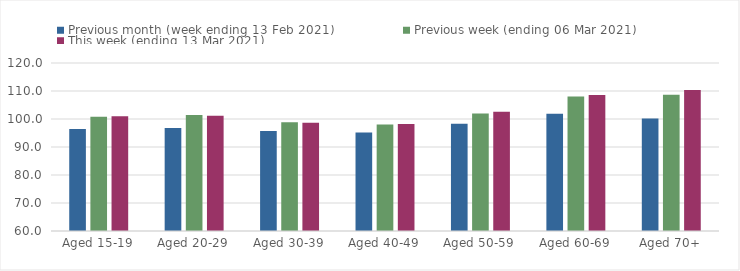
| Category | Previous month (week ending 13 Feb 2021) | Previous week (ending 06 Mar 2021) | This week (ending 13 Mar 2021) |
|---|---|---|---|
| Aged 15-19 | 96.42 | 100.82 | 100.96 |
| Aged 20-29 | 96.83 | 101.44 | 101.14 |
| Aged 30-39 | 95.67 | 98.81 | 98.64 |
| Aged 40-49 | 95.18 | 98.04 | 98.2 |
| Aged 50-59 | 98.27 | 101.97 | 102.6 |
| Aged 60-69 | 101.9 | 108 | 108.58 |
| Aged 70+ | 100.19 | 108.67 | 110.38 |